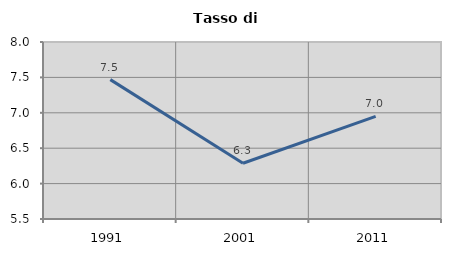
| Category | Tasso di disoccupazione   |
|---|---|
| 1991.0 | 7.468 |
| 2001.0 | 6.287 |
| 2011.0 | 6.951 |